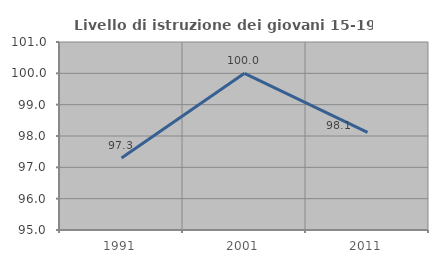
| Category | Livello di istruzione dei giovani 15-19 anni |
|---|---|
| 1991.0 | 97.297 |
| 2001.0 | 100 |
| 2011.0 | 98.113 |